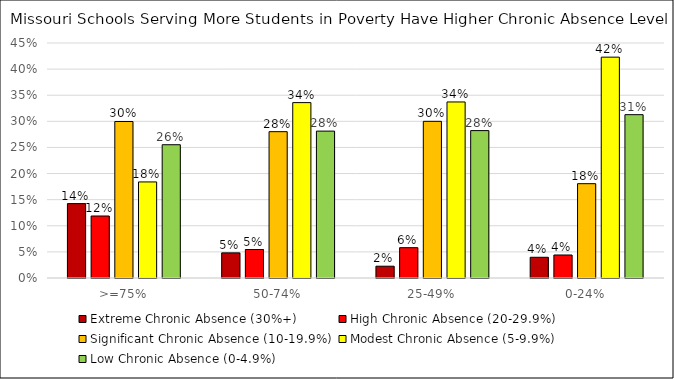
| Category | Extreme Chronic Absence (30%+) | High Chronic Absence (20-29.9%) | Significant Chronic Absence (10-19.9%) | Modest Chronic Absence (5-9.9%) | Low Chronic Absence (0-4.9%) |
|---|---|---|---|---|---|
| >=75% | 0.142 | 0.119 | 0.3 | 0.184 | 0.255 |
| 50-74% | 0.048 | 0.055 | 0.28 | 0.336 | 0.281 |
| 25-49% | 0.023 | 0.058 | 0.3 | 0.337 | 0.282 |
| 0-24% | 0.04 | 0.044 | 0.181 | 0.423 | 0.313 |